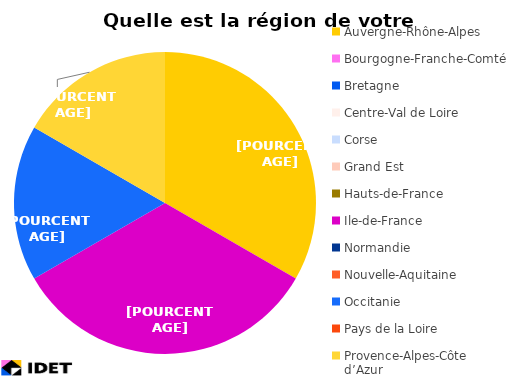
| Category | Series 0 |
|---|---|
| Auvergne-Rhône-Alpes | 2 |
| Bourgogne-Franche-Comté | 0 |
| Bretagne | 0 |
| Centre-Val de Loire | 0 |
| Corse | 0 |
| Grand Est | 0 |
| Hauts-de-France | 0 |
| Ile-de-France | 2 |
| Normandie | 0 |
| Nouvelle-Aquitaine | 0 |
| Occitanie | 1 |
| Pays de la Loire | 0 |
| Provence-Alpes-Côte d’Azur | 1 |